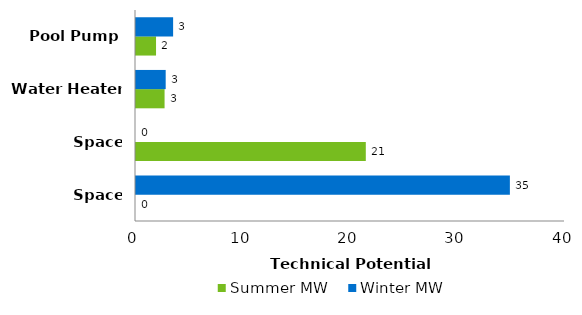
| Category | Summer MW | Winter MW |
|---|---|---|
| Space Heating | 0 | 34.86 |
| Space Cooling | 21.427 | 0 |
| Water Heater | 2.664 | 2.768 |
| Pool Pump | 1.868 | 3.461 |